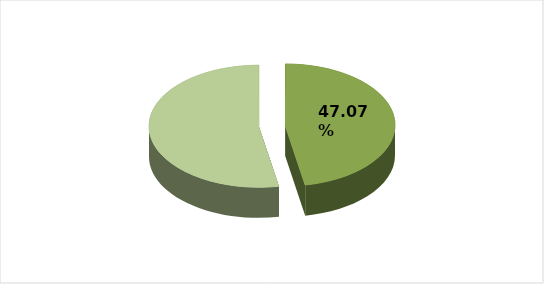
| Category | Series 0 |
|---|---|
| 0 | 0.471 |
| 1 | 0.529 |